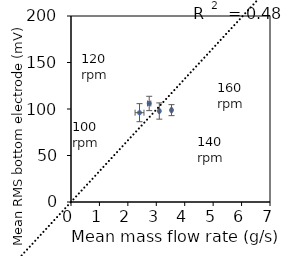
| Category | Series 0 |
|---|---|
| 2.4104666666666668 | 96.063 |
| 2.7510333333333334 | 105.961 |
| 3.106333333333333 | 97.821 |
| 3.5353666666666665 | 98.771 |